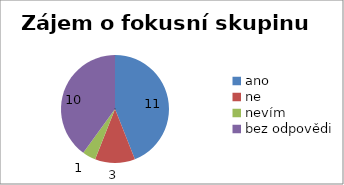
| Category | Zájem o fokusní skupinu |
|---|---|
| ano | 11 |
| ne  | 3 |
| nevím | 1 |
| bez odpovědi | 10 |